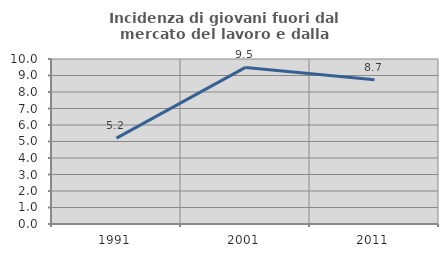
| Category | Incidenza di giovani fuori dal mercato del lavoro e dalla formazione  |
|---|---|
| 1991.0 | 5.202 |
| 2001.0 | 9.489 |
| 2011.0 | 8.738 |